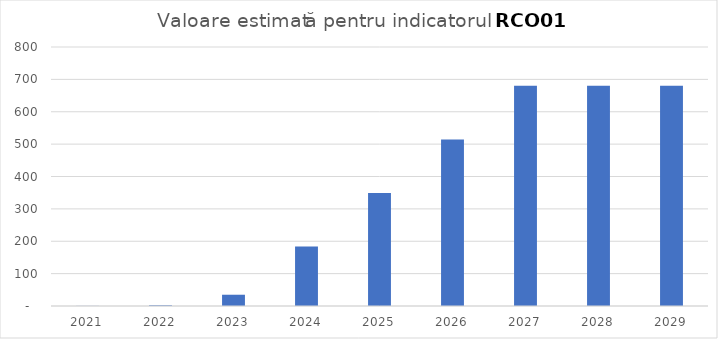
| Category | Series 0 |
|---|---|
| 2021.0 | 0.359 |
| 2022.0 | 2.153 |
| 2023.0 | 34.807 |
| 2024.0 | 183.721 |
| 2025.0 | 349.142 |
| 2026.0 | 514.563 |
| 2027.0 | 679.984 |
| 2028.0 | 679.984 |
| 2029.0 | 679.984 |